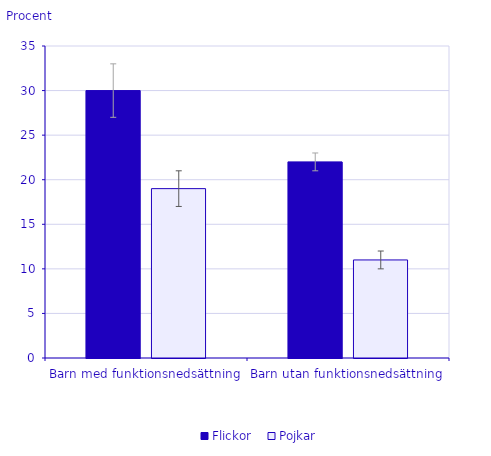
| Category | Flickor | Pojkar |
|---|---|---|
| Barn med funktionsnedsättning | 30 | 19 |
| Barn utan funktionsnedsättning | 22 | 11 |